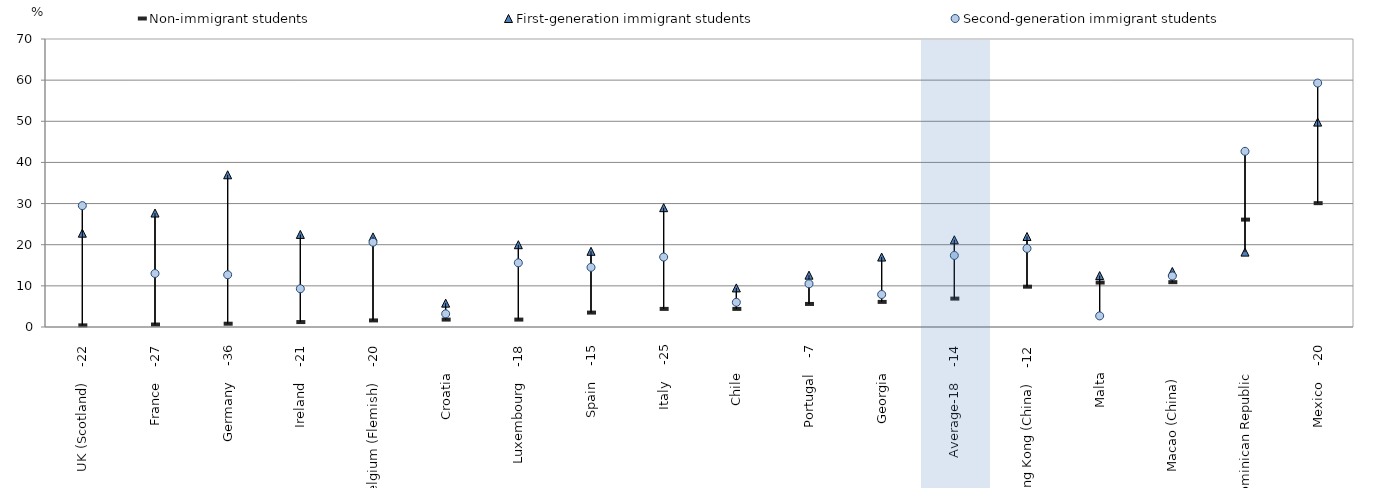
| Category | Non-immigrant students | First-generation immigrant students | Second-generation immigrant students |
|---|---|---|---|
| UK (Scotland)    -22 | 0.4 | 22.8 | 29.5 |
| France    -27 | 0.6 | 27.7 | 13 |
| Germany    -36 | 0.8 | 37 | 12.7 |
| Ireland    -21 | 1.2 | 22.5 | 9.3 |
| Belgium (Flemish)    -20 | 1.6 | 21.9 | 20.6 |
| Croatia        | 1.8 | 5.8 | 3.2 |
| Luxembourg    -18 | 1.8 | 20 | 15.6 |
| Spain    -15 | 3.5 | 18.4 | 14.5 |
| Italy    -25 | 4.4 | 29 | 17 |
| Chile        | 4.4 | 9.5 | 6 |
| Portugal    -7 | 5.6 | 12.6 | 10.5 |
| Georgia        | 6.1 | 17 | 7.9 |
| Average-18    -14 | 6.9 | 21.2 | 17.4 |
| Hong Kong (China)    -12 | 9.8 | 22 | 19.1 |
| Malta        | 10.8 | 12.5 | 2.7 |
| Macao (China)         | 10.9 | 13.5 | 12.4 |
| Dominican Republic        | 26.1 | 18.2 | 42.7 |
| Mexico    -20 | 30.1 | 49.8 | 59.3 |